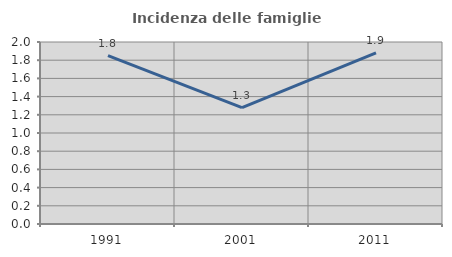
| Category | Incidenza delle famiglie numerose |
|---|---|
| 1991.0 | 1.85 |
| 2001.0 | 1.279 |
| 2011.0 | 1.881 |